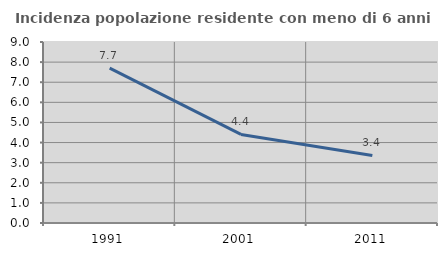
| Category | Incidenza popolazione residente con meno di 6 anni |
|---|---|
| 1991.0 | 7.703 |
| 2001.0 | 4.406 |
| 2011.0 | 3.359 |